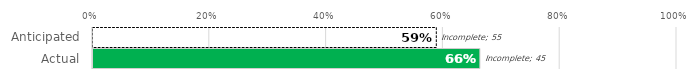
| Category | Complete | Incomplete |
|---|---|---|
| Anticipated | 79 | 55 |
| Actual | 89 | 45 |